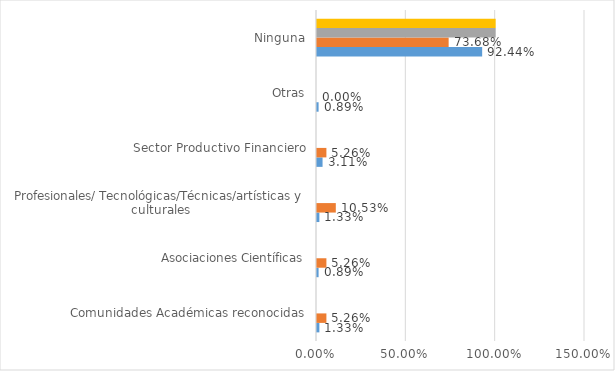
| Category | Series 0 | Series 1 | Series 2 | Series 3 |
|---|---|---|---|---|
| Comunidades Académicas reconocidas | 0.013 | 0.053 | 0 | 0 |
| Asociaciones Científicas | 0.009 | 0.053 | 0 | 0 |
| Profesionales/ Tecnológicas/Técnicas/artísticas y culturales | 0.013 | 0.105 | 0 | 0 |
| Sector Productivo Financiero | 0.031 | 0.053 | 0 | 0 |
| Otras | 0.009 | 0 | 0 | 0 |
| Ninguna | 0.924 | 0.737 | 1 | 1 |